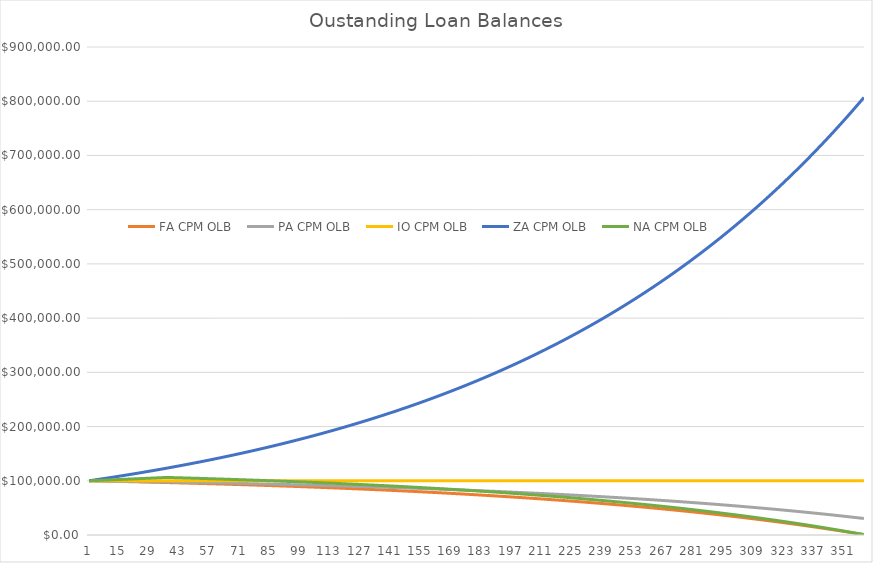
| Category | FA CPM OLB | PA CPM OLB | IO CPM OLB | ZA CPM OLB | NA CPM OLB |
|---|---|---|---|---|---|
| 0 | 100000 | 100000 | 100000 | 100000 | 100000 |
| 1 | 99918.031 | 99942.622 | 100000 | 100583.333 | 100166.667 |
| 2 | 99835.584 | 99884.908 | 100000 | 101170.069 | 100333.611 |
| 3 | 99752.655 | 99826.859 | 100000 | 101760.228 | 100500.834 |
| 4 | 99669.243 | 99768.47 | 100000 | 102353.83 | 100668.335 |
| 5 | 99585.345 | 99709.741 | 100000 | 102950.894 | 100836.116 |
| 6 | 99500.957 | 99650.67 | 100000 | 103551.44 | 101004.176 |
| 7 | 99416.076 | 99591.254 | 100000 | 104155.49 | 101172.516 |
| 8 | 99330.701 | 99531.491 | 100000 | 104763.064 | 101341.137 |
| 9 | 99244.828 | 99471.379 | 100000 | 105374.182 | 101510.039 |
| 10 | 99158.453 | 99410.917 | 100000 | 105988.865 | 101679.222 |
| 11 | 99071.575 | 99350.103 | 100000 | 106607.133 | 101848.688 |
| 12 | 98984.19 | 99288.933 | 100000 | 107229.008 | 102018.436 |
| 13 | 98896.295 | 99227.407 | 100000 | 107854.511 | 102188.466 |
| 14 | 98807.888 | 99165.522 | 100000 | 108483.662 | 102358.78 |
| 15 | 98718.965 | 99103.275 | 100000 | 109116.483 | 102529.378 |
| 16 | 98629.523 | 99040.666 | 100000 | 109752.996 | 102700.261 |
| 17 | 98539.559 | 98977.692 | 100000 | 110393.222 | 102871.428 |
| 18 | 98449.071 | 98914.35 | 100000 | 111037.182 | 103042.88 |
| 19 | 98358.055 | 98850.638 | 100000 | 111684.899 | 103214.618 |
| 20 | 98266.508 | 98786.555 | 100000 | 112336.395 | 103386.643 |
| 21 | 98174.426 | 98722.098 | 100000 | 112991.69 | 103558.954 |
| 22 | 98081.808 | 98657.266 | 100000 | 113650.808 | 103731.552 |
| 23 | 97988.649 | 98592.055 | 100000 | 114313.771 | 103904.438 |
| 24 | 97894.947 | 98526.463 | 100000 | 114980.602 | 104077.612 |
| 25 | 97800.699 | 98460.489 | 100000 | 115651.322 | 104251.075 |
| 26 | 97705.9 | 98394.13 | 100000 | 116325.955 | 104424.826 |
| 27 | 97610.549 | 98327.384 | 100000 | 117004.523 | 104598.868 |
| 28 | 97514.641 | 98260.249 | 100000 | 117687.049 | 104773.199 |
| 29 | 97418.174 | 98192.722 | 100000 | 118373.557 | 104947.821 |
| 30 | 97321.144 | 98124.801 | 100000 | 119064.069 | 105122.734 |
| 31 | 97223.549 | 98056.484 | 100000 | 119758.61 | 105297.939 |
| 32 | 97125.383 | 97987.768 | 100000 | 120457.202 | 105473.435 |
| 33 | 97026.646 | 97918.652 | 100000 | 121159.869 | 105649.224 |
| 34 | 96927.332 | 97849.132 | 100000 | 121866.634 | 105825.307 |
| 35 | 96827.439 | 97779.207 | 100000 | 122577.523 | 106001.682 |
| 36 | 96726.963 | 97708.874 | 100000 | 123292.559 | 106178.351 |
| 37 | 96625.901 | 97638.131 | 100000 | 124011.765 | 106067.415 |
| 38 | 96524.25 | 97566.975 | 100000 | 124735.167 | 105955.831 |
| 39 | 96422.005 | 97495.404 | 100000 | 125462.789 | 105843.596 |
| 40 | 96319.165 | 97423.415 | 100000 | 126194.655 | 105730.706 |
| 41 | 96215.724 | 97351.007 | 100000 | 126930.791 | 105617.158 |
| 42 | 96111.68 | 97278.176 | 100000 | 127671.22 | 105502.948 |
| 43 | 96007.029 | 97204.92 | 100000 | 128415.969 | 105388.071 |
| 44 | 95901.767 | 97131.237 | 100000 | 129165.062 | 105272.524 |
| 45 | 95795.892 | 97057.124 | 100000 | 129918.525 | 105156.303 |
| 46 | 95689.399 | 96982.579 | 100000 | 130676.383 | 105039.405 |
| 47 | 95582.284 | 96907.599 | 100000 | 131438.662 | 104921.824 |
| 48 | 95474.545 | 96832.182 | 100000 | 132205.388 | 104803.557 |
| 49 | 95366.178 | 96756.324 | 100000 | 132976.586 | 104684.601 |
| 50 | 95257.178 | 96680.024 | 100000 | 133752.283 | 104564.95 |
| 51 | 95147.542 | 96603.279 | 100000 | 134532.504 | 104444.602 |
| 52 | 95037.267 | 96526.087 | 100000 | 135317.277 | 104323.552 |
| 53 | 94926.349 | 96448.444 | 100000 | 136106.628 | 104201.795 |
| 54 | 94814.783 | 96370.348 | 100000 | 136900.583 | 104079.328 |
| 55 | 94702.567 | 96291.797 | 100000 | 137699.17 | 103956.147 |
| 56 | 94589.696 | 96212.787 | 100000 | 138502.415 | 103832.248 |
| 57 | 94476.167 | 96133.317 | 100000 | 139310.346 | 103707.625 |
| 58 | 94361.975 | 96053.383 | 100000 | 140122.99 | 103582.276 |
| 59 | 94247.118 | 95972.982 | 100000 | 140940.374 | 103456.195 |
| 60 | 94131.59 | 95892.113 | 100000 | 141762.526 | 103329.379 |
| 61 | 94015.388 | 95810.772 | 100000 | 142589.474 | 103201.823 |
| 62 | 93898.509 | 95728.956 | 100000 | 143421.246 | 103073.523 |
| 63 | 93780.948 | 95646.663 | 100000 | 144257.87 | 102944.475 |
| 64 | 93662.701 | 95563.891 | 100000 | 145099.374 | 102814.674 |
| 65 | 93543.764 | 95480.635 | 100000 | 145945.787 | 102684.116 |
| 66 | 93424.133 | 95396.893 | 100000 | 146797.138 | 102552.796 |
| 67 | 93303.805 | 95312.664 | 100000 | 147653.454 | 102420.71 |
| 68 | 93182.775 | 95227.942 | 100000 | 148514.766 | 102287.853 |
| 69 | 93061.038 | 95142.727 | 100000 | 149381.102 | 102154.222 |
| 70 | 92938.592 | 95057.014 | 100000 | 150252.492 | 102019.811 |
| 71 | 92815.431 | 94970.802 | 100000 | 151128.965 | 101884.616 |
| 72 | 92691.552 | 94884.087 | 100000 | 152010.55 | 101748.632 |
| 73 | 92566.95 | 94796.865 | 100000 | 152897.279 | 101611.855 |
| 74 | 92441.622 | 94709.135 | 100000 | 153789.179 | 101474.281 |
| 75 | 92315.562 | 94620.893 | 100000 | 154686.283 | 101335.904 |
| 76 | 92188.767 | 94532.137 | 100000 | 155588.62 | 101196.719 |
| 77 | 92061.232 | 94442.863 | 100000 | 156496.22 | 101056.723 |
| 78 | 91932.954 | 94353.068 | 100000 | 157409.115 | 100915.91 |
| 79 | 91803.927 | 94262.749 | 100000 | 158327.334 | 100774.275 |
| 80 | 91674.147 | 94171.903 | 100000 | 159250.91 | 100631.815 |
| 81 | 91543.611 | 94080.527 | 100000 | 160179.874 | 100488.523 |
| 82 | 91412.312 | 93988.619 | 100000 | 161114.257 | 100344.396 |
| 83 | 91280.248 | 93896.174 | 100000 | 162054.09 | 100199.427 |
| 84 | 91147.414 | 93803.19 | 100000 | 162999.405 | 100053.613 |
| 85 | 91013.805 | 93709.663 | 100000 | 163950.235 | 99906.949 |
| 86 | 90879.416 | 93615.591 | 100000 | 164906.612 | 99759.429 |
| 87 | 90744.244 | 93520.971 | 100000 | 165868.567 | 99611.048 |
| 88 | 90608.283 | 93425.798 | 100000 | 166836.134 | 99461.802 |
| 89 | 90471.528 | 93330.07 | 100000 | 167809.344 | 99311.685 |
| 90 | 90333.976 | 93233.784 | 100000 | 168788.232 | 99160.693 |
| 91 | 90195.622 | 93136.936 | 100000 | 169772.83 | 99008.82 |
| 92 | 90056.461 | 93039.523 | 100000 | 170763.172 | 98856.061 |
| 93 | 89916.488 | 92941.541 | 100000 | 171759.29 | 98702.411 |
| 94 | 89775.698 | 92842.989 | 100000 | 172761.219 | 98547.864 |
| 95 | 89634.087 | 92743.861 | 100000 | 173768.993 | 98392.416 |
| 96 | 89491.65 | 92644.155 | 100000 | 174782.646 | 98236.061 |
| 97 | 89348.382 | 92543.868 | 100000 | 175802.211 | 98078.794 |
| 98 | 89204.279 | 92442.995 | 100000 | 176827.724 | 97920.61 |
| 99 | 89059.334 | 92341.534 | 100000 | 177859.219 | 97761.503 |
| 100 | 88913.545 | 92239.481 | 100000 | 178896.731 | 97601.468 |
| 101 | 88766.905 | 92136.833 | 100000 | 179940.295 | 97440.499 |
| 102 | 88619.409 | 92033.586 | 100000 | 180989.947 | 97278.592 |
| 103 | 88471.053 | 91929.737 | 100000 | 182045.722 | 97115.74 |
| 104 | 88321.832 | 91825.282 | 100000 | 183107.655 | 96951.938 |
| 105 | 88171.74 | 91720.218 | 100000 | 184175.783 | 96787.18 |
| 106 | 88020.773 | 91614.541 | 100000 | 185250.142 | 96621.461 |
| 107 | 87868.925 | 91508.247 | 100000 | 186330.768 | 96454.776 |
| 108 | 87716.191 | 91401.334 | 100000 | 187417.697 | 96287.118 |
| 109 | 87562.566 | 91293.796 | 100000 | 188510.967 | 96118.483 |
| 110 | 87408.045 | 91185.632 | 100000 | 189610.614 | 95948.863 |
| 111 | 87252.623 | 91076.836 | 100000 | 190716.676 | 95778.254 |
| 112 | 87096.294 | 90967.406 | 100000 | 191829.19 | 95606.65 |
| 113 | 86939.053 | 90857.337 | 100000 | 192948.194 | 95434.045 |
| 114 | 86780.895 | 90746.627 | 100000 | 194073.725 | 95260.433 |
| 115 | 86621.815 | 90635.27 | 100000 | 195205.822 | 95085.808 |
| 116 | 86461.806 | 90523.264 | 100000 | 196344.522 | 94910.165 |
| 117 | 86300.864 | 90410.605 | 100000 | 197489.865 | 94733.497 |
| 118 | 86138.983 | 90297.288 | 100000 | 198641.89 | 94555.799 |
| 119 | 85976.158 | 90183.311 | 100000 | 199800.634 | 94377.064 |
| 120 | 85812.383 | 90068.668 | 100000 | 200966.138 | 94197.286 |
| 121 | 85647.653 | 89953.357 | 100000 | 202138.44 | 94016.46 |
| 122 | 85481.962 | 89837.373 | 100000 | 203317.581 | 93834.578 |
| 123 | 85315.304 | 89720.713 | 100000 | 204503.6 | 93651.636 |
| 124 | 85147.674 | 89603.372 | 100000 | 205696.538 | 93467.627 |
| 125 | 84979.067 | 89485.347 | 100000 | 206896.434 | 93282.544 |
| 126 | 84809.475 | 89366.633 | 100000 | 208103.33 | 93096.382 |
| 127 | 84638.895 | 89247.226 | 100000 | 209317.266 | 92909.133 |
| 128 | 84467.319 | 89127.123 | 100000 | 210538.284 | 92720.793 |
| 129 | 84294.743 | 89006.32 | 100000 | 211766.424 | 92531.354 |
| 130 | 84121.16 | 88884.812 | 100000 | 213001.728 | 92340.809 |
| 131 | 83946.564 | 88762.595 | 100000 | 214244.238 | 92149.153 |
| 132 | 83770.95 | 88639.665 | 100000 | 215493.996 | 91956.38 |
| 133 | 83594.311 | 88516.018 | 100000 | 216751.044 | 91762.481 |
| 134 | 83416.642 | 88391.649 | 100000 | 218015.425 | 91567.452 |
| 135 | 83237.937 | 88266.556 | 100000 | 219287.182 | 91371.285 |
| 136 | 83058.189 | 88140.732 | 100000 | 220566.357 | 91173.973 |
| 137 | 82877.392 | 88014.175 | 100000 | 221852.994 | 90975.511 |
| 138 | 82695.541 | 87886.879 | 100000 | 223147.137 | 90775.891 |
| 139 | 82512.629 | 87758.841 | 100000 | 224448.828 | 90575.106 |
| 140 | 82328.651 | 87630.055 | 100000 | 225758.113 | 90373.151 |
| 141 | 82143.599 | 87500.519 | 100000 | 227075.036 | 90170.017 |
| 142 | 81957.467 | 87370.227 | 100000 | 228399.64 | 89965.698 |
| 143 | 81770.25 | 87239.175 | 100000 | 229731.971 | 89760.187 |
| 144 | 81581.94 | 87107.358 | 100000 | 231072.074 | 89553.478 |
| 145 | 81392.533 | 86974.773 | 100000 | 232419.995 | 89345.563 |
| 146 | 81202.02 | 86841.414 | 100000 | 233775.778 | 89136.434 |
| 147 | 81010.396 | 86707.277 | 100000 | 235139.47 | 88926.086 |
| 148 | 80817.654 | 86572.358 | 100000 | 236511.117 | 88714.511 |
| 149 | 80623.788 | 86436.651 | 100000 | 237890.765 | 88501.702 |
| 150 | 80428.791 | 86300.154 | 100000 | 239278.461 | 88287.652 |
| 151 | 80232.656 | 86162.859 | 100000 | 240674.252 | 88072.352 |
| 152 | 80035.378 | 86024.764 | 100000 | 242078.186 | 87855.797 |
| 153 | 79836.948 | 85885.864 | 100000 | 243490.308 | 87637.979 |
| 154 | 79637.361 | 85746.153 | 100000 | 244910.668 | 87418.89 |
| 155 | 79436.61 | 85605.627 | 100000 | 246339.314 | 87198.523 |
| 156 | 79234.688 | 85464.281 | 100000 | 247776.293 | 86976.87 |
| 157 | 79031.587 | 85322.111 | 100000 | 249221.655 | 86753.925 |
| 158 | 78827.303 | 85179.112 | 100000 | 250675.448 | 86529.679 |
| 159 | 78621.826 | 85035.278 | 100000 | 252137.721 | 86304.125 |
| 160 | 78415.151 | 84890.606 | 100000 | 253608.525 | 86077.255 |
| 161 | 78207.27 | 84745.089 | 100000 | 255087.908 | 85849.062 |
| 162 | 77998.177 | 84598.724 | 100000 | 256575.921 | 85619.537 |
| 163 | 77787.863 | 84451.504 | 100000 | 258072.614 | 85388.674 |
| 164 | 77576.324 | 84303.426 | 100000 | 259578.037 | 85156.464 |
| 165 | 77363.55 | 84154.485 | 100000 | 261092.242 | 84922.899 |
| 166 | 77149.534 | 84004.674 | 100000 | 262615.28 | 84687.972 |
| 167 | 76934.271 | 83853.99 | 100000 | 264147.203 | 84451.675 |
| 168 | 76717.752 | 83702.426 | 100000 | 265688.062 | 84213.999 |
| 169 | 76499.969 | 83549.979 | 100000 | 267237.909 | 83974.937 |
| 170 | 76280.917 | 83396.642 | 100000 | 268796.796 | 83734.48 |
| 171 | 76060.586 | 83242.41 | 100000 | 270364.778 | 83492.621 |
| 172 | 75838.97 | 83087.279 | 100000 | 271941.906 | 83249.351 |
| 173 | 75616.062 | 82931.243 | 100000 | 273528.233 | 83004.661 |
| 174 | 75391.853 | 82774.297 | 100000 | 275123.815 | 82758.545 |
| 175 | 75166.336 | 82616.436 | 100000 | 276728.704 | 82510.992 |
| 176 | 74939.504 | 82457.653 | 100000 | 278342.954 | 82261.996 |
| 177 | 74711.349 | 82297.944 | 100000 | 279966.622 | 82011.547 |
| 178 | 74481.863 | 82137.304 | 100000 | 281599.76 | 81759.637 |
| 179 | 74251.038 | 81975.726 | 100000 | 283242.426 | 81506.258 |
| 180 | 74018.866 | 81813.206 | 100000 | 284894.673 | 81251.4 |
| 181 | 73785.34 | 81649.738 | 100000 | 286556.559 | 80995.056 |
| 182 | 73550.452 | 81485.317 | 100000 | 288228.139 | 80737.217 |
| 183 | 73314.194 | 81319.936 | 100000 | 289909.469 | 80477.873 |
| 184 | 73076.558 | 81153.591 | 100000 | 291600.608 | 80217.017 |
| 185 | 72837.535 | 80986.275 | 100000 | 293301.612 | 79954.639 |
| 186 | 72597.118 | 80817.983 | 100000 | 295012.538 | 79690.731 |
| 187 | 72355.299 | 80648.709 | 100000 | 296733.444 | 79425.283 |
| 188 | 72112.069 | 80478.448 | 100000 | 298464.389 | 79158.286 |
| 189 | 71867.42 | 80307.194 | 100000 | 300205.431 | 78889.732 |
| 190 | 71621.345 | 80134.941 | 100000 | 301956.63 | 78619.612 |
| 191 | 71373.833 | 79961.683 | 100000 | 303718.043 | 78347.916 |
| 192 | 71124.878 | 79787.415 | 100000 | 305489.732 | 78074.635 |
| 193 | 70874.471 | 79612.13 | 100000 | 307271.755 | 77799.759 |
| 194 | 70622.603 | 79435.822 | 100000 | 309064.174 | 77523.281 |
| 195 | 70369.265 | 79258.486 | 100000 | 310867.048 | 77245.189 |
| 196 | 70114.45 | 79080.115 | 100000 | 312680.44 | 76965.476 |
| 197 | 69858.149 | 78900.704 | 100000 | 314504.409 | 76684.131 |
| 198 | 69600.352 | 78720.246 | 100000 | 316339.018 | 76401.144 |
| 199 | 69341.052 | 78538.736 | 100000 | 318184.329 | 76116.507 |
| 200 | 69080.239 | 78356.167 | 100000 | 320040.404 | 75830.209 |
| 201 | 68817.904 | 78172.533 | 100000 | 321907.306 | 75542.242 |
| 202 | 68554.039 | 77987.828 | 100000 | 323785.099 | 75252.594 |
| 203 | 68288.636 | 77802.045 | 100000 | 325673.845 | 74961.257 |
| 204 | 68021.683 | 77615.178 | 100000 | 327573.609 | 74668.22 |
| 205 | 67753.174 | 77427.222 | 100000 | 329484.456 | 74373.475 |
| 206 | 67483.098 | 77238.169 | 100000 | 331406.448 | 74077.009 |
| 207 | 67211.447 | 77048.013 | 100000 | 333339.652 | 73778.815 |
| 208 | 66938.212 | 76856.748 | 100000 | 335284.134 | 73478.88 |
| 209 | 66663.382 | 76664.367 | 100000 | 337239.958 | 73177.197 |
| 210 | 66386.949 | 76470.864 | 100000 | 339207.191 | 72873.753 |
| 211 | 66108.904 | 76276.233 | 100000 | 341185.9 | 72568.539 |
| 212 | 65829.237 | 76080.466 | 100000 | 343176.151 | 72261.545 |
| 213 | 65547.938 | 75883.557 | 100000 | 345178.012 | 71952.761 |
| 214 | 65264.999 | 75685.499 | 100000 | 347191.55 | 71642.174 |
| 215 | 64980.409 | 75486.286 | 100000 | 349216.834 | 71329.777 |
| 216 | 64694.158 | 75285.911 | 100000 | 351253.932 | 71015.556 |
| 217 | 64406.239 | 75084.367 | 100000 | 353302.913 | 70699.503 |
| 218 | 64116.639 | 74881.647 | 100000 | 355363.847 | 70381.606 |
| 219 | 63825.35 | 74677.745 | 100000 | 357436.803 | 70061.855 |
| 220 | 63532.362 | 74472.654 | 100000 | 359521.851 | 69740.239 |
| 221 | 63237.665 | 74266.366 | 100000 | 361619.062 | 69416.746 |
| 222 | 62941.249 | 74058.874 | 100000 | 363728.506 | 69091.367 |
| 223 | 62643.104 | 73850.173 | 100000 | 365850.256 | 68764.089 |
| 224 | 62343.22 | 73640.254 | 100000 | 367984.382 | 68434.902 |
| 225 | 62041.586 | 73429.11 | 100000 | 370130.958 | 68103.796 |
| 226 | 61738.193 | 73216.735 | 100000 | 372290.055 | 67770.757 |
| 227 | 61433.03 | 73003.121 | 100000 | 374461.747 | 67435.776 |
| 228 | 61126.086 | 72788.261 | 100000 | 376646.107 | 67098.841 |
| 229 | 60817.353 | 72572.147 | 100000 | 378843.21 | 66759.94 |
| 230 | 60506.818 | 72354.773 | 100000 | 381053.128 | 66419.063 |
| 231 | 60194.472 | 72136.131 | 100000 | 383275.938 | 66076.197 |
| 232 | 59880.304 | 71916.213 | 100000 | 385511.715 | 65731.33 |
| 233 | 59564.303 | 71695.012 | 100000 | 387760.533 | 65384.453 |
| 234 | 59246.459 | 71472.522 | 100000 | 390022.469 | 65035.551 |
| 235 | 58926.761 | 71248.733 | 100000 | 392297.6 | 64684.615 |
| 236 | 58605.198 | 71023.639 | 100000 | 394586.003 | 64331.631 |
| 237 | 58281.759 | 70797.231 | 100000 | 396887.755 | 63976.589 |
| 238 | 57956.434 | 70569.504 | 100000 | 399202.933 | 63619.475 |
| 239 | 57629.21 | 70340.447 | 100000 | 401531.617 | 63260.278 |
| 240 | 57300.078 | 70110.055 | 100000 | 403873.885 | 62898.986 |
| 241 | 56969.026 | 69878.318 | 100000 | 406229.816 | 62535.586 |
| 242 | 56636.043 | 69645.23 | 100000 | 408599.49 | 62170.066 |
| 243 | 56301.118 | 69410.782 | 100000 | 410982.987 | 61802.414 |
| 244 | 55964.238 | 69174.967 | 100000 | 413380.388 | 61432.618 |
| 245 | 55625.394 | 68937.776 | 100000 | 415791.773 | 61060.664 |
| 246 | 55284.573 | 68699.201 | 100000 | 418217.225 | 60686.541 |
| 247 | 54941.764 | 68459.235 | 100000 | 420656.826 | 60310.235 |
| 248 | 54596.955 | 68217.868 | 100000 | 423110.657 | 59931.734 |
| 249 | 54250.134 | 67975.094 | 100000 | 425578.803 | 59551.025 |
| 250 | 53901.291 | 67730.904 | 100000 | 428061.346 | 59168.096 |
| 251 | 53550.413 | 67485.289 | 100000 | 430558.37 | 58782.933 |
| 252 | 53197.488 | 67238.241 | 100000 | 433069.961 | 58395.522 |
| 253 | 52842.504 | 66989.753 | 100000 | 435596.202 | 58005.852 |
| 254 | 52485.449 | 66739.815 | 100000 | 438137.18 | 57613.909 |
| 255 | 52126.312 | 66488.418 | 100000 | 440692.98 | 57219.68 |
| 256 | 51765.08 | 66235.556 | 100000 | 443263.689 | 56823.151 |
| 257 | 51401.74 | 65981.218 | 100000 | 445849.394 | 56424.309 |
| 258 | 51036.281 | 65725.397 | 100000 | 448450.182 | 56023.14 |
| 259 | 50668.69 | 65468.083 | 100000 | 451066.142 | 55619.631 |
| 260 | 50298.955 | 65209.269 | 100000 | 453697.361 | 55213.768 |
| 261 | 49927.063 | 64948.944 | 100000 | 456343.929 | 54805.538 |
| 262 | 49553.002 | 64687.101 | 100000 | 459005.935 | 54394.926 |
| 263 | 49176.759 | 64423.731 | 100000 | 461683.47 | 53981.92 |
| 264 | 48798.32 | 64158.824 | 100000 | 464376.623 | 53566.504 |
| 265 | 48417.675 | 63892.372 | 100000 | 467085.487 | 53148.664 |
| 266 | 48034.809 | 63624.366 | 100000 | 469810.152 | 52728.388 |
| 267 | 47649.709 | 63354.797 | 100000 | 472550.711 | 52305.659 |
| 268 | 47262.363 | 63083.654 | 100000 | 475307.257 | 51880.465 |
| 269 | 46872.758 | 62810.931 | 100000 | 478079.883 | 51452.791 |
| 270 | 46480.88 | 62536.616 | 100000 | 480868.682 | 51022.621 |
| 271 | 46086.716 | 62260.701 | 100000 | 483673.749 | 50589.943 |
| 272 | 45690.253 | 61983.177 | 100000 | 486495.18 | 50154.74 |
| 273 | 45291.477 | 61704.034 | 100000 | 489333.068 | 49716.999 |
| 274 | 44890.374 | 61423.262 | 100000 | 492187.511 | 49276.704 |
| 275 | 44486.932 | 61140.853 | 100000 | 495058.605 | 48833.841 |
| 276 | 44081.137 | 60856.796 | 100000 | 497946.447 | 48388.395 |
| 277 | 43672.975 | 60571.082 | 100000 | 500851.134 | 47940.35 |
| 278 | 43262.431 | 60283.702 | 100000 | 503772.766 | 47489.691 |
| 279 | 42849.493 | 59994.645 | 100000 | 506711.44 | 47036.404 |
| 280 | 42434.146 | 59703.902 | 100000 | 509667.257 | 46580.472 |
| 281 | 42016.376 | 59411.463 | 100000 | 512640.316 | 46121.881 |
| 282 | 41596.169 | 59117.318 | 100000 | 515630.718 | 45660.615 |
| 283 | 41173.511 | 58821.457 | 100000 | 518638.564 | 45196.658 |
| 284 | 40748.387 | 58523.871 | 100000 | 521663.956 | 44729.995 |
| 285 | 40320.783 | 58224.548 | 100000 | 524706.995 | 44260.609 |
| 286 | 39890.685 | 57923.48 | 100000 | 527767.786 | 43788.485 |
| 287 | 39458.078 | 57620.655 | 100000 | 530846.432 | 43313.608 |
| 288 | 39022.948 | 57316.064 | 100000 | 533943.036 | 42835.96 |
| 289 | 38585.279 | 57009.696 | 100000 | 537057.703 | 42355.526 |
| 290 | 38145.058 | 56701.54 | 100000 | 540190.54 | 41872.289 |
| 291 | 37702.268 | 56391.588 | 100000 | 543341.652 | 41386.233 |
| 292 | 37256.896 | 56079.827 | 100000 | 546511.144 | 40897.343 |
| 293 | 36808.925 | 55766.247 | 100000 | 549699.126 | 40405.6 |
| 294 | 36358.341 | 55450.839 | 100000 | 552905.704 | 39910.989 |
| 295 | 35905.129 | 55133.59 | 100000 | 556130.988 | 39413.492 |
| 296 | 35449.273 | 54814.491 | 100000 | 559375.085 | 38913.094 |
| 297 | 34990.758 | 54493.531 | 100000 | 562638.106 | 38409.776 |
| 298 | 34529.568 | 54170.698 | 100000 | 565920.162 | 37903.523 |
| 299 | 34065.688 | 53845.982 | 100000 | 569221.363 | 37394.316 |
| 300 | 33599.102 | 53519.372 | 100000 | 572541.821 | 36882.139 |
| 301 | 33129.795 | 53190.856 | 100000 | 575881.648 | 36366.974 |
| 302 | 32657.749 | 52860.424 | 100000 | 579240.958 | 35848.804 |
| 303 | 32182.95 | 52528.065 | 100000 | 582619.863 | 35327.612 |
| 304 | 31705.382 | 52193.767 | 100000 | 586018.479 | 34803.379 |
| 305 | 31225.027 | 51857.519 | 100000 | 589436.92 | 34276.088 |
| 306 | 30741.871 | 51519.309 | 100000 | 592875.302 | 33745.721 |
| 307 | 30255.896 | 51179.127 | 100000 | 596333.742 | 33212.261 |
| 308 | 29767.086 | 50836.96 | 100000 | 599812.355 | 32675.689 |
| 309 | 29275.425 | 50492.797 | 100000 | 603311.261 | 32135.986 |
| 310 | 28780.896 | 50146.627 | 100000 | 606830.576 | 31593.136 |
| 311 | 28283.482 | 49798.437 | 100000 | 610370.421 | 31047.118 |
| 312 | 27783.166 | 49448.216 | 100000 | 613930.915 | 30497.916 |
| 313 | 27279.932 | 49095.953 | 100000 | 617512.179 | 29945.51 |
| 314 | 26773.763 | 48741.634 | 100000 | 621114.334 | 29389.881 |
| 315 | 26264.64 | 48385.248 | 100000 | 624737.5 | 28831.012 |
| 316 | 25752.548 | 48026.784 | 100000 | 628381.803 | 28268.882 |
| 317 | 25237.469 | 47666.228 | 100000 | 632047.363 | 27703.473 |
| 318 | 24719.385 | 47303.57 | 100000 | 635734.306 | 27134.766 |
| 319 | 24198.279 | 46938.795 | 100000 | 639442.756 | 26562.742 |
| 320 | 23674.133 | 46571.893 | 100000 | 643172.839 | 25987.381 |
| 321 | 23146.93 | 46202.851 | 100000 | 646924.68 | 25408.663 |
| 322 | 22616.651 | 45831.656 | 100000 | 650698.408 | 24826.57 |
| 323 | 22083.279 | 45458.295 | 100000 | 654494.148 | 24241.081 |
| 324 | 21546.796 | 45082.757 | 100000 | 658312.031 | 23652.177 |
| 325 | 21007.183 | 44705.028 | 100000 | 662152.184 | 23059.837 |
| 326 | 20464.422 | 44325.096 | 100000 | 666014.739 | 22464.042 |
| 327 | 19918.495 | 43942.947 | 100000 | 669899.825 | 21864.772 |
| 328 | 19369.384 | 43558.569 | 100000 | 673807.574 | 21262.006 |
| 329 | 18817.07 | 43171.949 | 100000 | 677738.118 | 20655.724 |
| 330 | 18261.534 | 42783.073 | 100000 | 681691.59 | 20045.905 |
| 331 | 17702.757 | 42391.93 | 100000 | 685668.125 | 19432.529 |
| 332 | 17140.72 | 41998.504 | 100000 | 689667.855 | 18815.575 |
| 333 | 16575.405 | 41602.784 | 100000 | 693690.918 | 18195.022 |
| 334 | 16006.793 | 41204.755 | 100000 | 697737.448 | 17570.849 |
| 335 | 15434.863 | 40804.404 | 100000 | 701807.583 | 16943.035 |
| 336 | 14859.597 | 40401.718 | 100000 | 705901.461 | 16311.559 |
| 337 | 14280.976 | 39996.683 | 100000 | 710019.219 | 15676.399 |
| 338 | 13698.979 | 39589.285 | 100000 | 714160.998 | 15037.534 |
| 339 | 13113.587 | 39179.511 | 100000 | 718326.937 | 14394.942 |
| 340 | 12524.781 | 38767.346 | 100000 | 722517.178 | 13748.602 |
| 341 | 11932.539 | 38352.778 | 100000 | 726731.861 | 13098.492 |
| 342 | 11336.843 | 37935.79 | 100000 | 730971.131 | 12444.589 |
| 343 | 10737.672 | 37516.371 | 100000 | 735235.129 | 11786.872 |
| 344 | 10135.006 | 37094.504 | 100000 | 739524 | 11125.318 |
| 345 | 9528.825 | 36670.177 | 100000 | 743837.89 | 10459.906 |
| 346 | 8919.107 | 36243.375 | 100000 | 748176.945 | 9790.611 |
| 347 | 8305.833 | 35814.083 | 100000 | 752541.31 | 9117.412 |
| 348 | 7688.981 | 35382.287 | 100000 | 756931.135 | 8440.287 |
| 349 | 7068.531 | 34947.972 | 100000 | 761346.566 | 7759.211 |
| 350 | 6444.461 | 34511.123 | 100000 | 765787.755 | 7074.163 |
| 351 | 5816.752 | 34071.726 | 100000 | 770254.85 | 6385.118 |
| 352 | 5185.38 | 33629.766 | 100000 | 774748.003 | 5692.054 |
| 353 | 4550.326 | 33185.228 | 100000 | 779267.366 | 4994.947 |
| 354 | 3911.567 | 32738.097 | 100000 | 783813.093 | 4293.774 |
| 355 | 3269.082 | 32288.357 | 100000 | 788385.336 | 3588.51 |
| 356 | 2622.849 | 31835.994 | 100000 | 792984.25 | 2879.133 |
| 357 | 1972.846 | 31380.992 | 100000 | 797609.992 | 2165.617 |
| 358 | 1319.052 | 30923.336 | 100000 | 802262.717 | 1447.939 |
| 359 | 661.444 | 30463.011 | 100000 | 806942.582 | 726.075 |